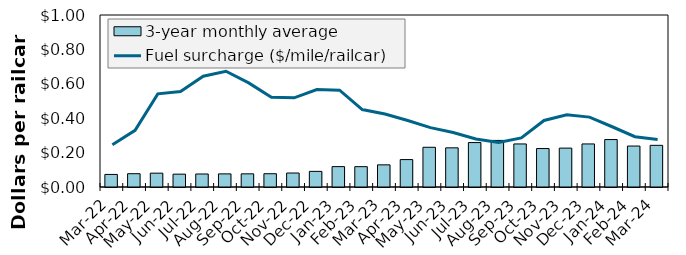
| Category | 3-year monthly average  |
|---|---|
| Mar-22 | 0.073 |
| Apr-22 | 0.077 |
| May-22 | 0.08 |
| Jun-22 | 0.075 |
| Jul-22 | 0.076 |
| Aug-22 | 0.076 |
| Sep-22 | 0.077 |
| Oct-22 | 0.077 |
| Nov-22 | 0.081 |
| Dec-22 | 0.091 |
| Jan-23 | 0.119 |
| Feb-23 | 0.118 |
| Mar-23 | 0.129 |
| Apr-23 | 0.159 |
| May-23 | 0.231 |
| Jun-23 | 0.228 |
| Jul-23 | 0.258 |
| Aug-23 | 0.271 |
| Sep-23 | 0.25 |
| Oct-23 | 0.224 |
| Nov-23 | 0.226 |
| Dec-23 | 0.25 |
| Jan-24 | 0.276 |
| Feb-24 | 0.238 |
| Mar-24 | 0.242 |